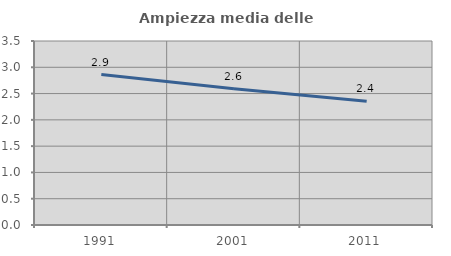
| Category | Ampiezza media delle famiglie |
|---|---|
| 1991.0 | 2.861 |
| 2001.0 | 2.592 |
| 2011.0 | 2.352 |